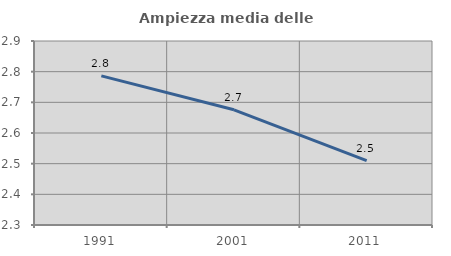
| Category | Ampiezza media delle famiglie |
|---|---|
| 1991.0 | 2.786 |
| 2001.0 | 2.676 |
| 2011.0 | 2.51 |